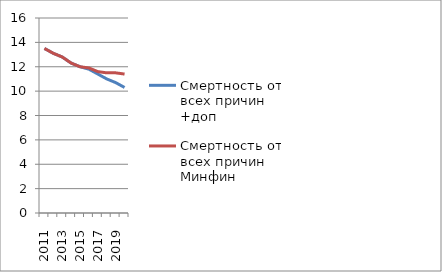
| Category | Смертность от всех причин +доп | Смертность от всех причин Минфин |
|---|---|---|
| 2011.0 | 13.5 | 13.5 |
| 2012.0 | 13.1 | 13.1 |
| 2013.0 | 12.8 | 12.8 |
| 2014.0 | 12.3 | 12.3 |
| 2015.0 | 12 | 12 |
| 2016.0 | 11.8 | 11.9 |
| 2017.0 | 11.4 | 11.6 |
| 2018.0 | 11 | 11.5 |
| 2019.0 | 10.7 | 11.5 |
| 2020.0 | 10.3 | 11.4 |